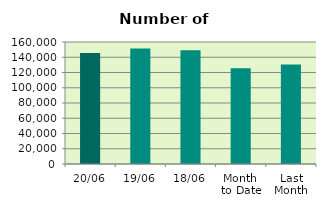
| Category | Series 0 |
|---|---|
| 20/06 | 145432 |
| 19/06 | 151520 |
| 18/06 | 149266 |
| Month 
to Date | 125524 |
| Last
Month | 130647.636 |